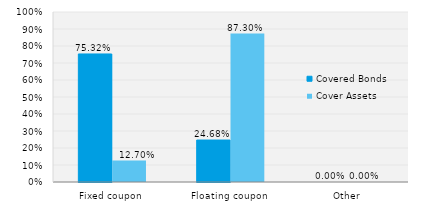
| Category | Covered Bonds | Cover Assets |
|---|---|---|
| Fixed coupon | 0.753 | 0.127 |
| Floating coupon | 0.247 | 0.873 |
| Other | 0 | 0 |